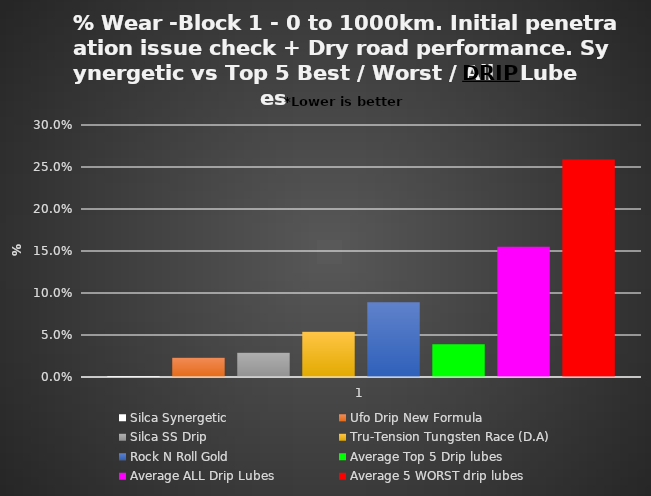
| Category | Silca Synergetic | Ufo Drip New Formula | Silca SS Drip  | Tru-Tension Tungsten Race (D.A) | Rock N Roll Gold | Average Top 5 Drip lubes | Average ALL Drip Lubes | Average 5 WORST drip lubes |
|---|---|---|---|---|---|---|---|---|
| 0 | 0.001 | 0.023 | 0.029 | 0.054 | 0.089 | 0.039 | 0.155 | 0.259 |